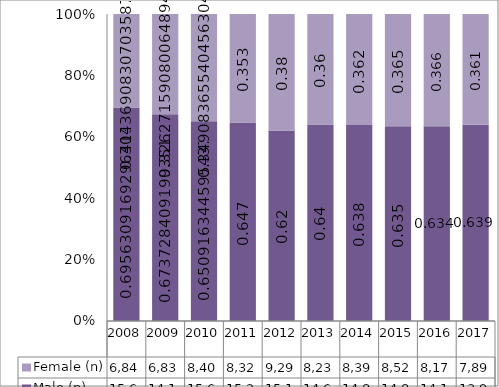
| Category | Male (n) | Female (n) |
|---|---|---|
| 2008.0 | 15651 | 6848 |
| 2009.0 | 14120 | 6838 |
| 2010.0 | 15663 | 8400 |
| 2011.0 | 15232 | 8322 |
| 2012.0 | 15190 | 9296 |
| 2013.0 | 14614 | 8232 |
| 2014.0 | 14818 | 8398 |
| 2015.0 | 14800 | 8523 |
| 2016.0 | 14176 | 8178 |
| 2017.0 | 13993 | 7898 |